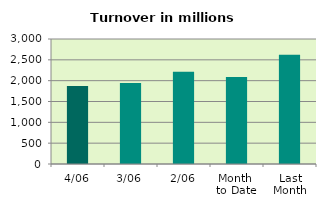
| Category | Series 0 |
|---|---|
| 4/06 | 1871.615 |
| 3/06 | 1944.724 |
| 2/06 | 2215.528 |
| Month 
to Date | 2090.082 |
| Last
Month | 2619.784 |